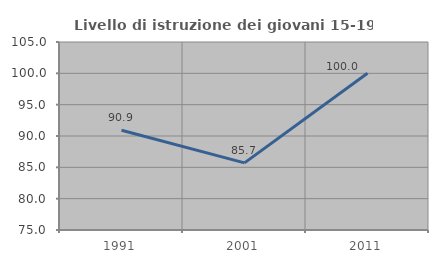
| Category | Livello di istruzione dei giovani 15-19 anni |
|---|---|
| 1991.0 | 90.909 |
| 2001.0 | 85.714 |
| 2011.0 | 100 |